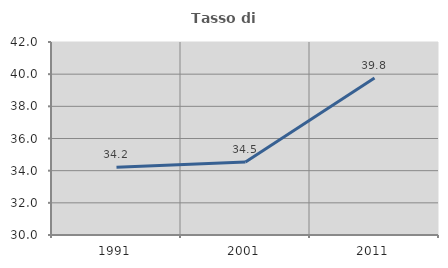
| Category | Tasso di occupazione   |
|---|---|
| 1991.0 | 34.211 |
| 2001.0 | 34.544 |
| 2011.0 | 39.756 |